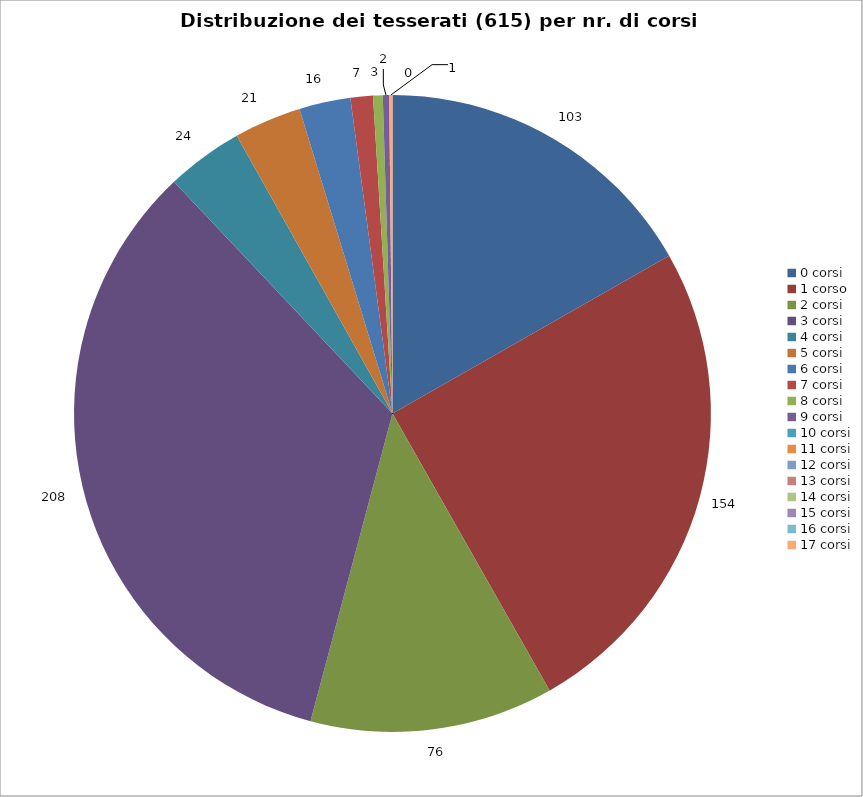
| Category | Nr. Tesserati |
|---|---|
| 0 corsi | 103 |
| 1 corso | 154 |
| 2 corsi | 76 |
| 3 corsi | 208 |
| 4 corsi | 24 |
| 5 corsi | 21 |
| 6 corsi | 16 |
| 7 corsi | 7 |
| 8 corsi | 3 |
| 9 corsi | 2 |
| 10 corsi | 0 |
| 11 corsi | 0 |
| 12 corsi | 0 |
| 13 corsi | 0 |
| 14 corsi | 0 |
| 15 corsi | 0 |
| 16 corsi | 0 |
| 17 corsi | 1 |